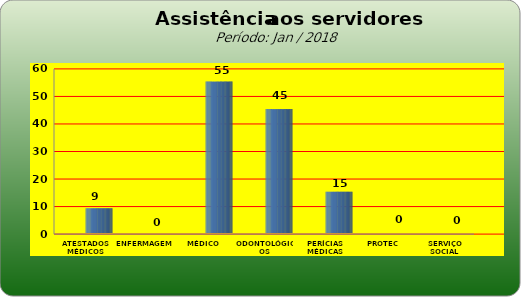
| Category | Series 0 |
|---|---|
| ATESTADOS MÉDICOS | 9 |
| ENFERMAGEM | 0 |
| MÉDICO | 55 |
| ODONTOLÓGICOS | 45 |
| PERÍCIAS MÉDICAS | 15 |
| PROTEC | 0 |
| SERVIÇO SOCIAL | 0 |